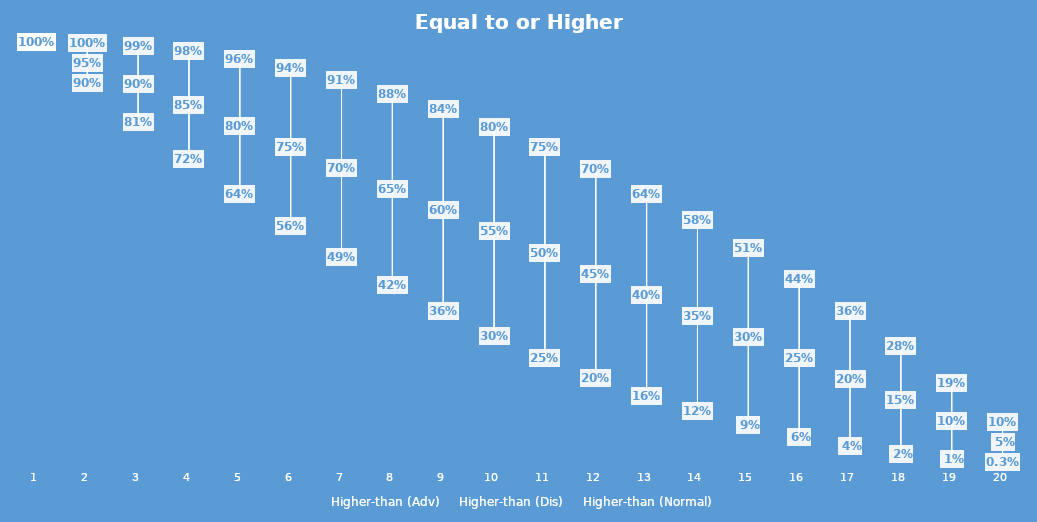
| Category | Higher-than (Adv) | Higher-than (Dis) | Higher-than (Normal) |
|---|---|---|---|
| 1.0 | 1 | 1 | 1 |
| 2.0 | 0.998 | 0.902 | 0.95 |
| 3.0 | 0.99 | 0.81 | 0.9 |
| 4.0 | 0.978 | 0.722 | 0.85 |
| 5.0 | 0.96 | 0.64 | 0.8 |
| 6.0 | 0.938 | 0.562 | 0.75 |
| 7.0 | 0.91 | 0.49 | 0.7 |
| 8.0 | 0.878 | 0.422 | 0.65 |
| 9.0 | 0.84 | 0.36 | 0.6 |
| 10.0 | 0.798 | 0.303 | 0.55 |
| 11.0 | 0.75 | 0.25 | 0.5 |
| 12.0 | 0.698 | 0.202 | 0.45 |
| 13.0 | 0.64 | 0.16 | 0.4 |
| 14.0 | 0.578 | 0.122 | 0.35 |
| 15.0 | 0.51 | 0.09 | 0.3 |
| 16.0 | 0.438 | 0.062 | 0.25 |
| 17.0 | 0.36 | 0.04 | 0.2 |
| 18.0 | 0.277 | 0.022 | 0.15 |
| 19.0 | 0.19 | 0.01 | 0.1 |
| 20.0 | 0.098 | 0.002 | 0.05 |